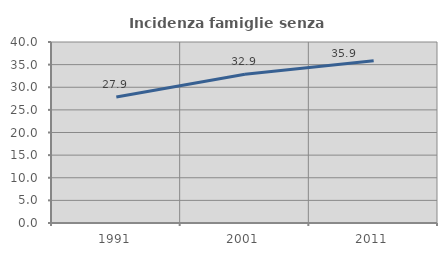
| Category | Incidenza famiglie senza nuclei |
|---|---|
| 1991.0 | 27.859 |
| 2001.0 | 32.877 |
| 2011.0 | 35.857 |